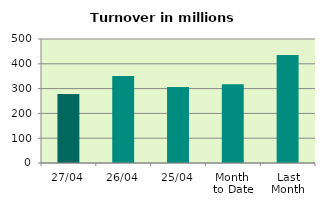
| Category | Series 0 |
|---|---|
| 27/04 | 278.151 |
| 26/04 | 350.596 |
| 25/04 | 306 |
| Month 
to Date | 317.654 |
| Last
Month | 435.216 |